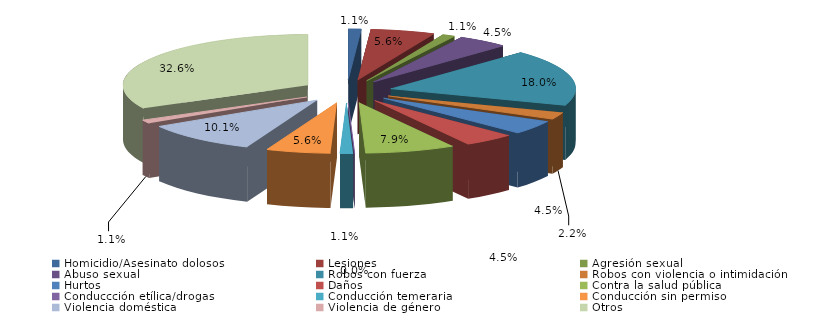
| Category | Series 0 |
|---|---|
| Homicidio/Asesinato dolosos | 1 |
| Lesiones | 5 |
| Agresión sexual | 1 |
| Abuso sexual | 4 |
| Robos con fuerza | 16 |
| Robos con violencia o intimidación | 2 |
| Hurtos | 4 |
| Daños | 4 |
| Contra la salud pública | 7 |
| Conduccción etílica/drogas | 0 |
| Conducción temeraria | 1 |
| Conducción sin permiso | 5 |
| Violencia doméstica | 9 |
| Violencia de género | 1 |
| Otros | 29 |